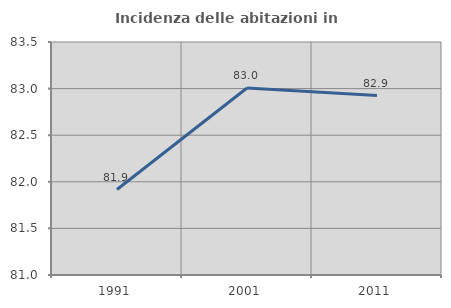
| Category | Incidenza delle abitazioni in proprietà  |
|---|---|
| 1991.0 | 81.917 |
| 2001.0 | 83.006 |
| 2011.0 | 82.926 |